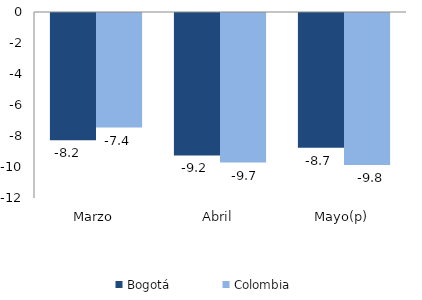
| Category | Bogotá | Colombia |
|---|---|---|
| Marzo | -8.202 | -7.393 |
| Abril | -9.187 | -9.651 |
| Mayo(p) | -8.695 | -9.807 |